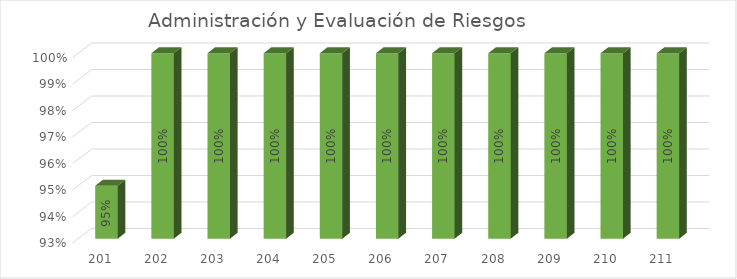
| Category | % Avance |
|---|---|
| 201.0 | 0.95 |
| 202.0 | 1 |
| 203.0 | 1 |
| 204.0 | 1 |
| 205.0 | 1 |
| 206.0 | 1 |
| 207.0 | 1 |
| 208.0 | 1 |
| 209.0 | 1 |
| 210.0 | 1 |
| 211.0 | 1 |